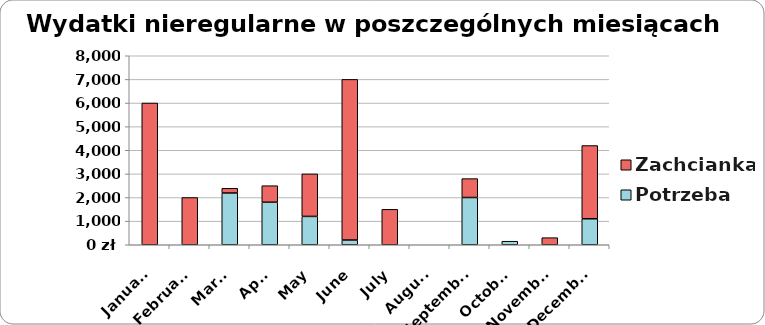
| Category | Potrzeba | Zachcianka |
|---|---|---|
| 2024-01-01 | 0 | 6000 |
| 2024-02-01 | 0 | 2000 |
| 2024-03-01 | 2190 | 200 |
| 2024-04-01 | 1800 | 700 |
| 2024-05-01 | 1200 | 1800 |
| 2024-06-01 | 200 | 6800 |
| 2024-07-01 | 0 | 1500 |
| 2024-08-01 | 0 | 0 |
| 2024-09-01 | 2000 | 800 |
| 2024-10-01 | 150 | 0 |
| 2024-11-01 | 0 | 300 |
| 2024-12-01 | 1100 | 3100 |